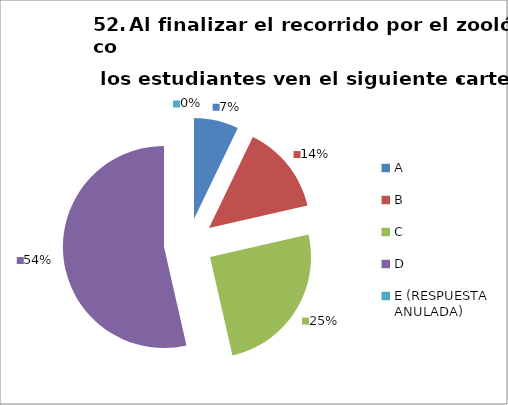
| Category | CANTIDAD DE RESPUESTAS PREGUNTA (52) | PORCENTAJE |
|---|---|---|
| A | 2 | 0.071 |
| B | 4 | 0.143 |
| C | 7 | 0.25 |
| D | 15 | 0.536 |
| E (RESPUESTA ANULADA) | 0 | 0 |